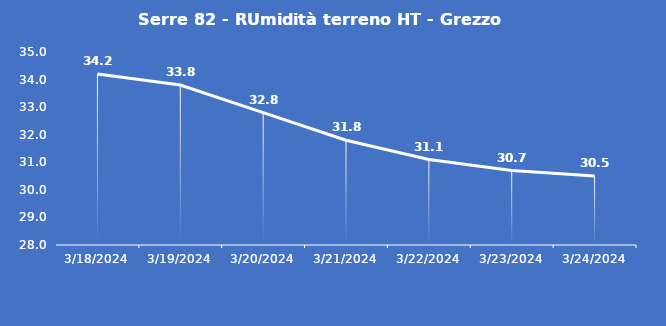
| Category | Serre 82 - RUmidità terreno HT - Grezzo (%VWC) |
|---|---|
| 3/18/24 | 34.2 |
| 3/19/24 | 33.8 |
| 3/20/24 | 32.8 |
| 3/21/24 | 31.8 |
| 3/22/24 | 31.1 |
| 3/23/24 | 30.7 |
| 3/24/24 | 30.5 |